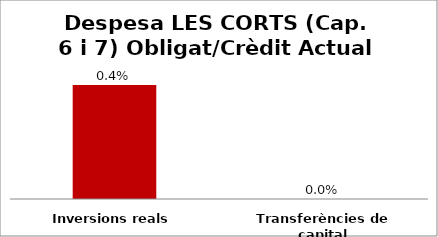
| Category | Series 0 |
|---|---|
| Inversions reals | 0.004 |
| Transferències de capital | 0 |